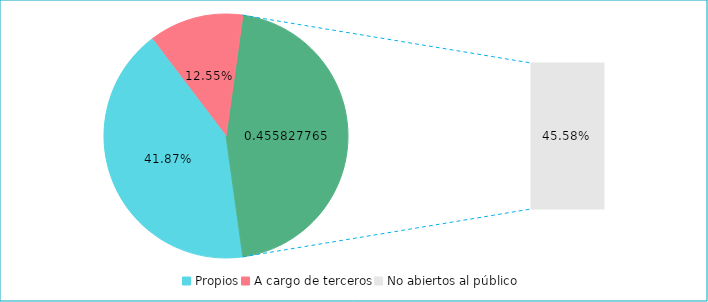
| Category | Series 0 |
|---|---|
| Propios | 0.419 |
| A cargo de terceros | 0.125 |
| No abiertos al público | 0.456 |